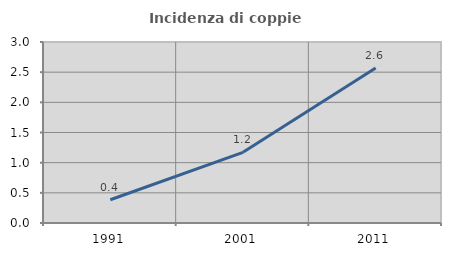
| Category | Incidenza di coppie miste |
|---|---|
| 1991.0 | 0.385 |
| 2001.0 | 1.172 |
| 2011.0 | 2.57 |